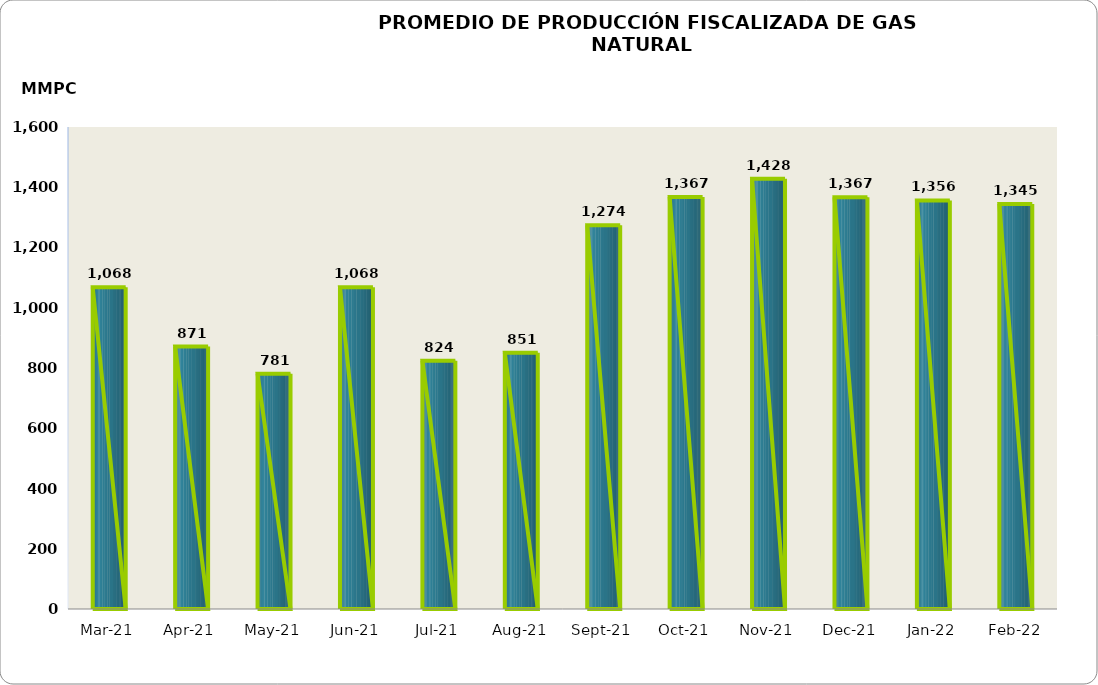
| Category | Series 0 |
|---|---|
| 2021-03-01 | 1067744.591 |
| 2021-04-01 | 871274.072 |
| 2021-05-01 | 780865.314 |
| 2021-06-01 | 1068128.403 |
| 2021-07-01 | 823834.105 |
| 2021-08-01 | 850929.254 |
| 2021-09-01 | 1273570.561 |
| 2021-10-01 | 1367318.609 |
| 2021-11-01 | 1428097.616 |
| 2021-12-01 | 1366833.527 |
| 2022-01-01 | 1356402.082 |
| 2022-02-01 | 1344504.622 |